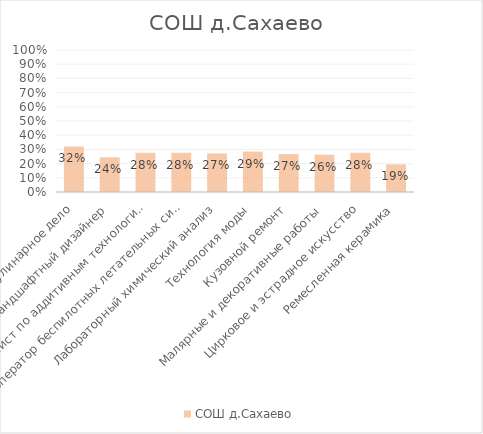
| Category | СОШ д.Сахаево |
|---|---|
| Кулинарное дело | 0.321 |
| Ландшафтный дизайнер | 0.244 |
| Специалист по аддитивным технологиям | 0.276 |
| Оператор беспилотных летательных систем | 0.276 |
| Лабораторный химический анализ | 0.271 |
| Технология моды | 0.285 |
| Кузовной ремонт | 0.267 |
| Малярные и декоративные работы | 0.262 |
| Цирковое и эстрадное искусство | 0.276 |
| Ремесленная керамика | 0.195 |